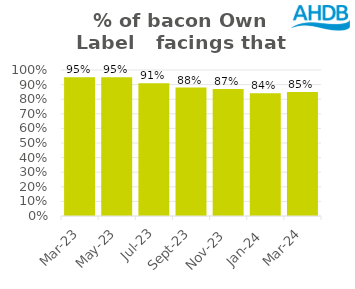
| Category | Bacon |
|---|---|
| 2023-03-01 | 0.95 |
| 2023-05-01 | 0.95 |
| 2023-07-01 | 0.91 |
| 2023-09-01 | 0.88 |
| 2023-11-01 | 0.87 |
| 2024-01-01 | 0.84 |
| 2024-03-01 | 0.85 |